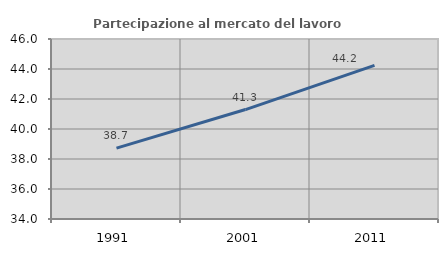
| Category | Partecipazione al mercato del lavoro  femminile |
|---|---|
| 1991.0 | 38.722 |
| 2001.0 | 41.297 |
| 2011.0 | 44.244 |